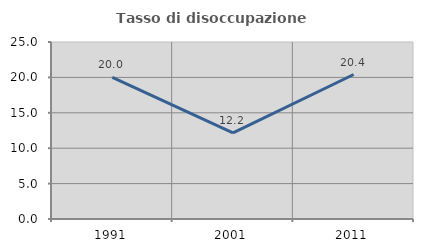
| Category | Tasso di disoccupazione giovanile  |
|---|---|
| 1991.0 | 20 |
| 2001.0 | 12.162 |
| 2011.0 | 20.408 |